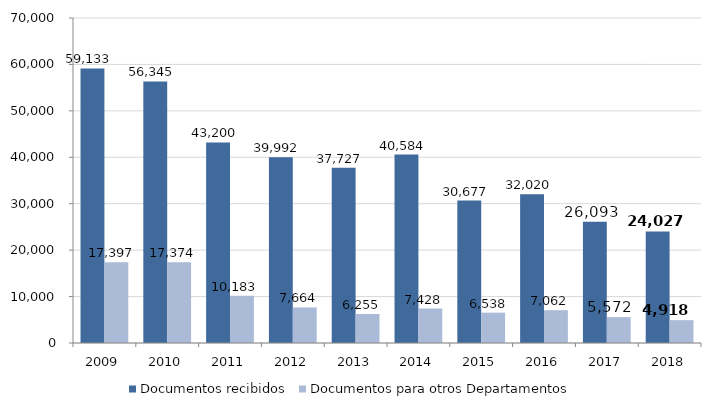
| Category | Documentos recibidos | Documentos para otros Departamentos |
|---|---|---|
| 2009.0 | 59133 | 17397 |
| 2010.0 | 56345 | 17374 |
| 2011.0 | 43200 | 10183 |
| 2012.0 | 39992 | 7664 |
| 2013.0 | 37727 | 6255 |
| 2014.0 | 40584 | 7428 |
| 2015.0 | 30677 | 6538 |
| 2016.0 | 32020 | 7062 |
| 2017.0 | 26093 | 5572 |
| 2018.0 | 24027 | 4918 |